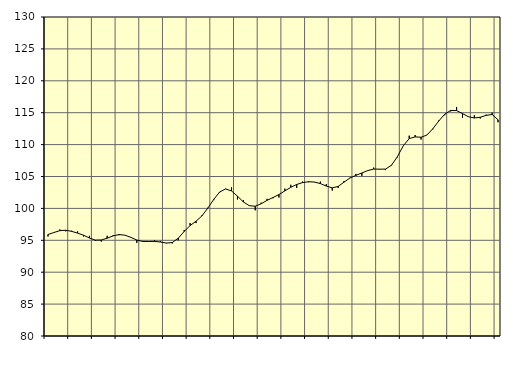
| Category | Piggar | Samtliga fast anställda (inkl. fast anställda utomlands) |
|---|---|---|
| nan | 95.6 | 95.9 |
| 1.0 | 96.2 | 96.22 |
| 1.0 | 96.7 | 96.51 |
| 1.0 | 96.4 | 96.58 |
| nan | 96.5 | 96.4 |
| 2.0 | 96.4 | 96.13 |
| 2.0 | 95.6 | 95.8 |
| 2.0 | 95.7 | 95.36 |
| nan | 94.9 | 95.03 |
| 3.0 | 94.8 | 95.05 |
| 3.0 | 95.7 | 95.33 |
| 3.0 | 95.8 | 95.69 |
| nan | 95.8 | 95.9 |
| 4.0 | 95.8 | 95.8 |
| 4.0 | 95.5 | 95.46 |
| 4.0 | 94.6 | 95.04 |
| nan | 94.9 | 94.82 |
| 5.0 | 94.8 | 94.81 |
| 5.0 | 95 | 94.83 |
| 5.0 | 94.9 | 94.73 |
| nan | 94.6 | 94.56 |
| 6.0 | 94.5 | 94.65 |
| 6.0 | 95 | 95.33 |
| 6.0 | 96.6 | 96.38 |
| nan | 97.7 | 97.31 |
| 7.0 | 97.7 | 97.99 |
| 7.0 | 98.9 | 98.82 |
| 7.0 | 100.1 | 100.05 |
| nan | 101.3 | 101.42 |
| 8.0 | 102.5 | 102.58 |
| 8.0 | 103.1 | 103.05 |
| 8.0 | 103.3 | 102.73 |
| nan | 101.4 | 101.92 |
| 9.0 | 101.3 | 101.01 |
| 9.0 | 100.4 | 100.43 |
| 9.0 | 99.7 | 100.34 |
| nan | 100.9 | 100.72 |
| 10.0 | 101.5 | 101.27 |
| 10.0 | 101.6 | 101.7 |
| 10.0 | 101.7 | 102.17 |
| nan | 103.1 | 102.74 |
| 11.0 | 103.7 | 103.31 |
| 11.0 | 103.2 | 103.75 |
| 11.0 | 104.2 | 104.04 |
| nan | 104.1 | 104.18 |
| 12.0 | 104.1 | 104.13 |
| 12.0 | 104.2 | 103.89 |
| 12.0 | 103.8 | 103.5 |
| nan | 102.8 | 103.22 |
| 13.0 | 103.2 | 103.44 |
| 13.0 | 104.3 | 104.12 |
| 13.0 | 104.8 | 104.77 |
| nan | 105.4 | 105.18 |
| 14.0 | 105.1 | 105.55 |
| 14.0 | 105.9 | 105.93 |
| 14.0 | 106.4 | 106.17 |
| nan | 106.1 | 106.15 |
| 15.0 | 106 | 106.16 |
| 15.0 | 106.7 | 106.76 |
| 15.0 | 108 | 108.1 |
| nan | 109.8 | 109.81 |
| 16.0 | 111.4 | 110.94 |
| 16.0 | 111.5 | 111.21 |
| 16.0 | 110.8 | 111.15 |
| nan | 111.5 | 111.5 |
| 17.0 | 112.4 | 112.5 |
| 17.0 | 113.8 | 113.71 |
| 17.0 | 114.6 | 114.77 |
| nan | 115.2 | 115.36 |
| 18.0 | 115.9 | 115.33 |
| 18.0 | 114.2 | 114.86 |
| 18.0 | 114.4 | 114.37 |
| nan | 114.6 | 114.17 |
| 19.0 | 114.1 | 114.29 |
| 19.0 | 114.7 | 114.58 |
| 19.0 | 115 | 114.72 |
| nan | 113.5 | 113.89 |